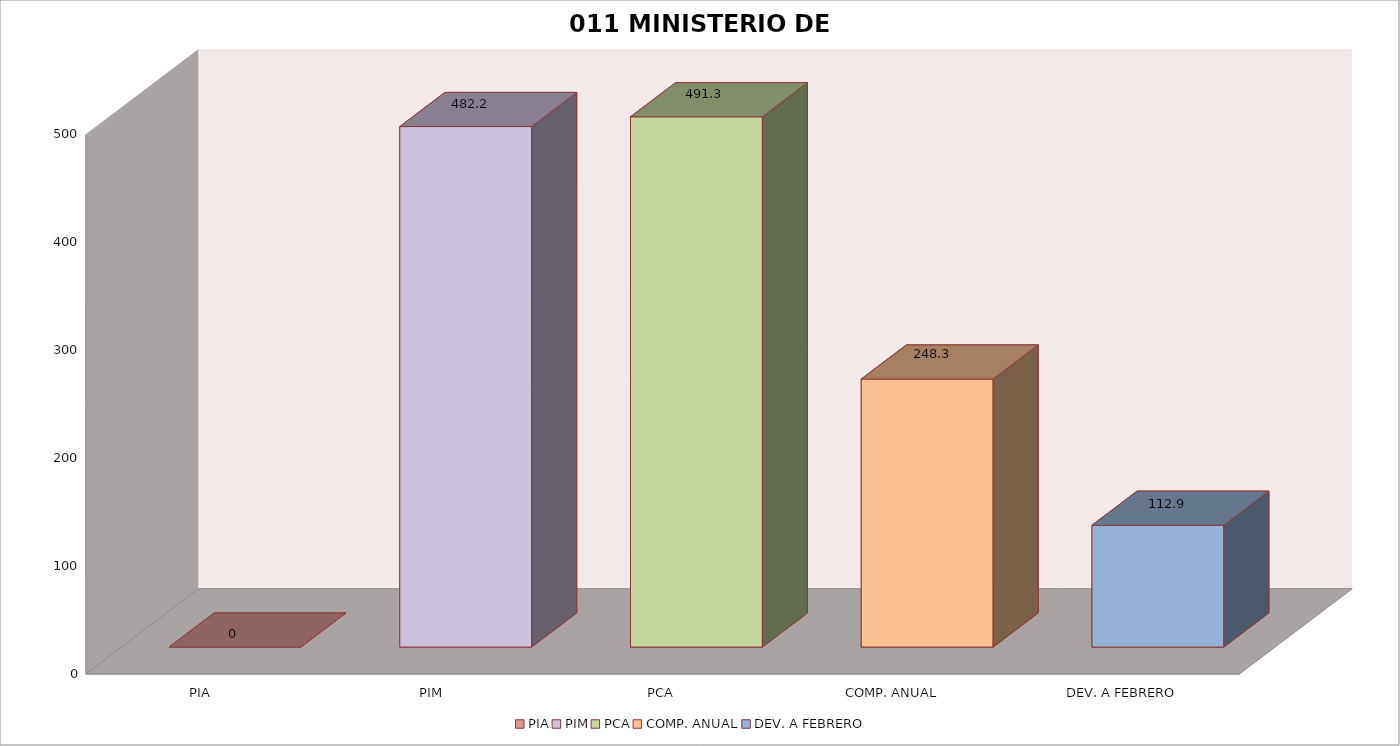
| Category | 011 MINISTERIO DE SALUD |
|---|---|
| PIA | 0 |
| PIM | 482.231 |
| PCA | 491.272 |
| COMP. ANUAL | 248.314 |
| DEV. A FEBRERO | 112.873 |